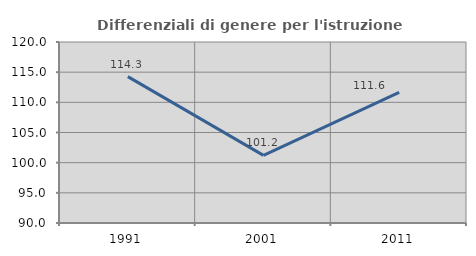
| Category | Differenziali di genere per l'istruzione superiore |
|---|---|
| 1991.0 | 114.264 |
| 2001.0 | 101.21 |
| 2011.0 | 111.64 |